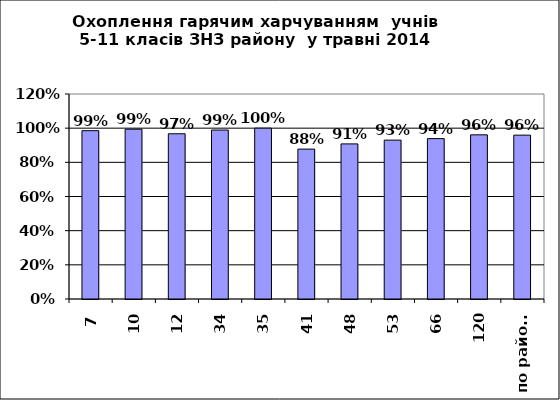
| Category | Series 0 |
|---|---|
| 7 | 0.985 |
| 10 | 0.994 |
| 12 | 0.967 |
| 34 | 0.989 |
| 35 | 1 |
| 41 | 0.877 |
| 48 | 0.908 |
| 53 | 0.93 |
| 66 | 0.939 |
| 120 | 0.961 |
| по району | 0.959 |